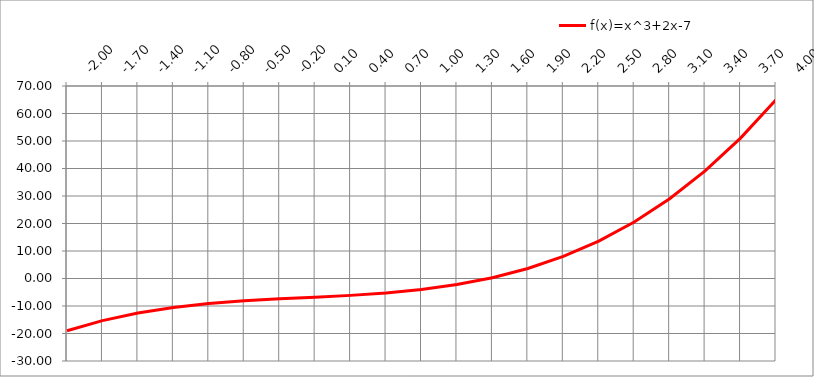
| Category | f(x)=x^3+2x-7 |
|---|---|
| -2.0 | -19 |
| -1.7 | -15.313 |
| -1.4 | -12.544 |
| -1.0999999999999999 | -10.531 |
| -0.7999999999999998 | -9.112 |
| -0.49999999999999983 | -8.125 |
| -0.19999999999999984 | -7.408 |
| 0.10000000000000014 | -6.799 |
| 0.40000000000000013 | -6.136 |
| 0.7000000000000002 | -5.257 |
| 1.0000000000000002 | -4 |
| 1.3000000000000003 | -2.203 |
| 1.6000000000000003 | 0.296 |
| 1.9000000000000004 | 3.659 |
| 2.2 | 8.048 |
| 2.5 | 13.625 |
| 2.8 | 20.552 |
| 3.0999999999999996 | 28.991 |
| 3.3999999999999995 | 39.104 |
| 3.6999999999999993 | 51.053 |
| 3.999999999999999 | 65 |